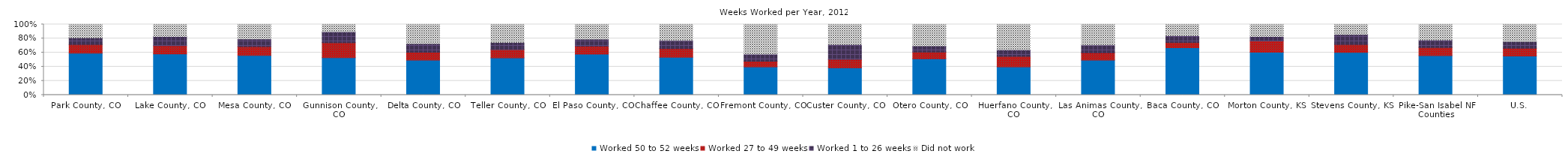
| Category | Worked 50 to 52 weeks | Worked 27 to 49 weeks | Worked 1 to 26 weeks | Did not work |
|---|---|---|---|---|
| Gallatin County, MT | 0.567 | 0.167 | 0.139 | 0.127 |
| County Region | 0.567 | 0.167 | 0.139 | 0.127 |
| U.S. | 0.554 | 0.108 | 0.095 | 0.243 |